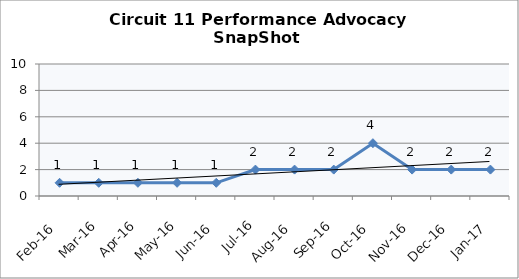
| Category | Circuit 11 |
|---|---|
| Feb-16 | 1 |
| Mar-16 | 1 |
| Apr-16 | 1 |
| May-16 | 1 |
| Jun-16 | 1 |
| Jul-16 | 2 |
| Aug-16 | 2 |
| Sep-16 | 2 |
| Oct-16 | 4 |
| Nov-16 | 2 |
| Dec-16 | 2 |
| Jan-17 | 2 |